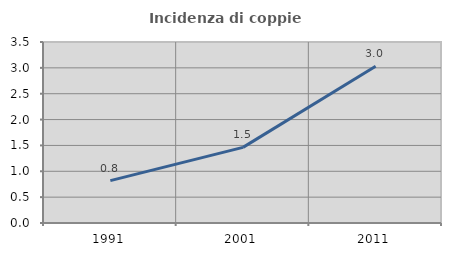
| Category | Incidenza di coppie miste |
|---|---|
| 1991.0 | 0.82 |
| 2001.0 | 1.463 |
| 2011.0 | 3.03 |